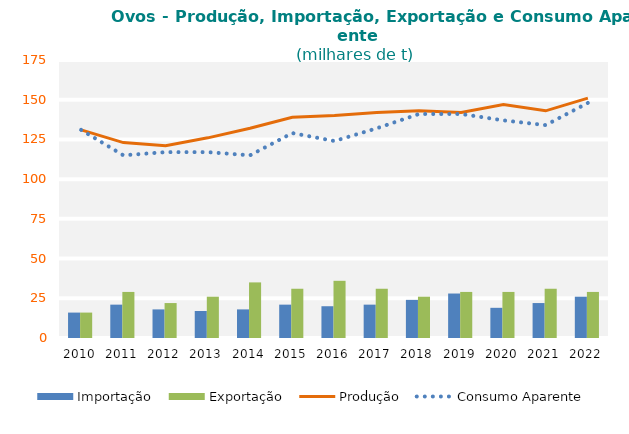
| Category | Importação | Exportação |
|---|---|---|
| 2010.0 | 16 | 16 |
| 2011.0 | 21 | 29 |
| 2012.0 | 18 | 22 |
| 2013.0 | 17 | 26 |
| 2014.0 | 18 | 35 |
| 2015.0 | 21 | 31 |
| 2016.0 | 20 | 36 |
| 2017.0 | 21 | 31 |
| 2018.0 | 24 | 26 |
| 2019.0 | 28 | 29 |
| 2020.0 | 19 | 29 |
| 2021.0 | 22 | 31 |
| 2022.0 | 26 | 29 |